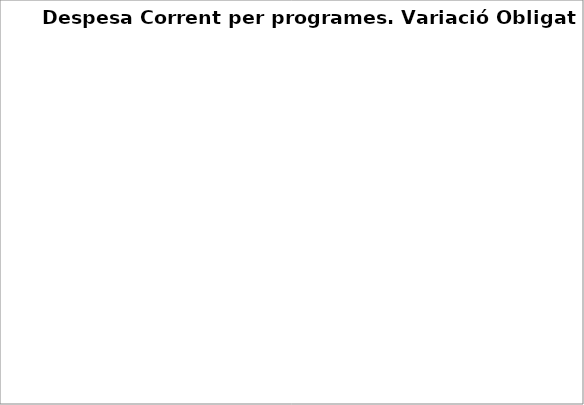
| Category | Series 0 |
|---|---|
| Deute Públic | -0.16 |
| Serveis públics bàsics | 0.056 |
| Actuacions de protecció i promoció social | 0.078 |
| Béns públics de caràcter preferent | 0.075 |
| Actuacions de caràcter econòmic | 0.421 |
| Actuacions de caràcter general | 0.003 |